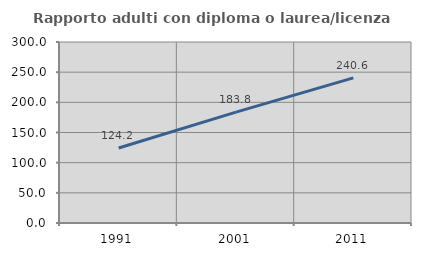
| Category | Rapporto adulti con diploma o laurea/licenza media  |
|---|---|
| 1991.0 | 124.231 |
| 2001.0 | 183.847 |
| 2011.0 | 240.553 |